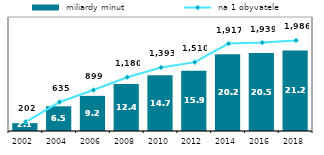
| Category |  miliardy minut |
|---|---|
| 2002.0 | 2.066 |
| 2004.0 | 6.495 |
| 2006.0 | 9.249 |
| 2008.0 | 12.351 |
| 2010.0 | 14.669 |
| 2012.0 | 15.875 |
| 2014.0 | 20.197 |
| 2016.0 | 20.511 |
| 2018.0 | 21.152 |